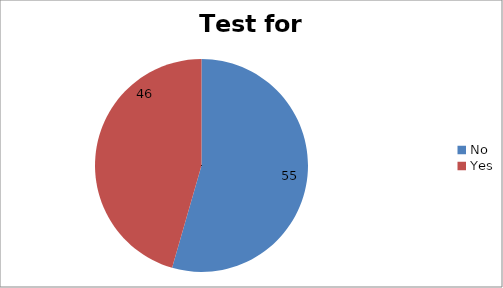
| Category | Series 0 |
|---|---|
| No | 55 |
| Yes | 46 |